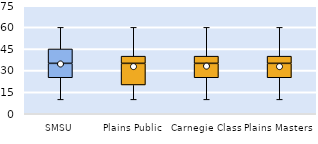
| Category | 25th | 50th | 75th |
|---|---|---|---|
| SMSU | 25 | 10 | 10 |
| Plains Public | 20 | 15 | 5 |
| Carnegie Class | 25 | 10 | 5 |
| Plains Masters | 25 | 10 | 5 |